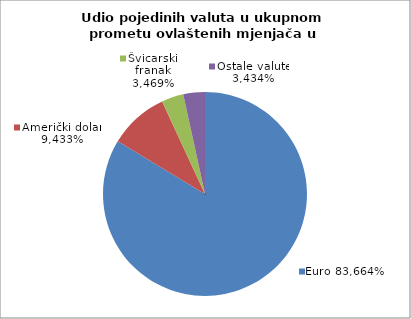
| Category | EUR |
|---|---|
| 0 | 0.837 |
| 1 | 0.094 |
| 2 | 0.035 |
| 3 | 0.034 |